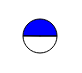
| Category | Series 0 |
|---|---|
| 0 | 7293384 |
| 1 | 7257731 |